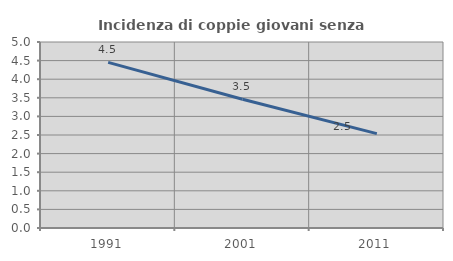
| Category | Incidenza di coppie giovani senza figli |
|---|---|
| 1991.0 | 4.453 |
| 2001.0 | 3.463 |
| 2011.0 | 2.538 |